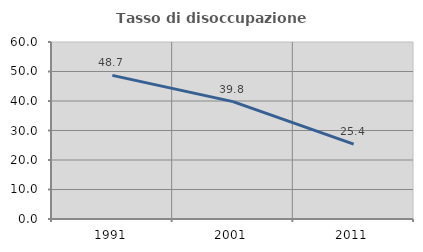
| Category | Tasso di disoccupazione giovanile  |
|---|---|
| 1991.0 | 48.678 |
| 2001.0 | 39.793 |
| 2011.0 | 25.402 |